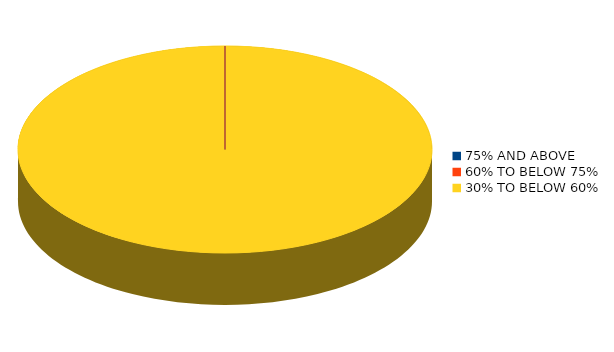
| Category | Number of students |
|---|---|
| 75% AND ABOVE | 0 |
| 60% TO BELOW 75% | 0 |
| 30% TO BELOW 60% | 21 |